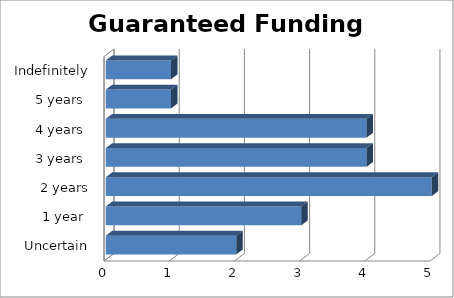
| Category | Series 0 |
|---|---|
| Uncertain | 2 |
| 1 year  | 3 |
| 2 years | 5 |
| 3 years  | 4 |
| 4 years  | 4 |
| 5 years  | 1 |
| Indefinitely | 1 |